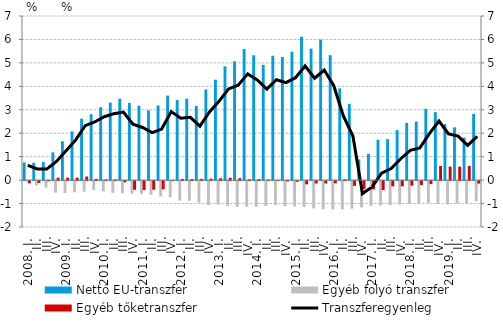
| Category | Nettó EU-transzfer | Egyéb folyó transzfer | Egyéb tőketranszfer |
|---|---|---|---|
| 2008. I. | 0.75 | -0.024 | -0.097 |
|          II. | 0.743 | -0.185 | -0.082 |
|          III. | 0.767 | -0.28 | -0.013 |
|          IV. | 1.184 | -0.492 | 0.103 |
| 2009. I. | 1.658 | -0.508 | 0.104 |
|          II. | 2.079 | -0.479 | 0.104 |
|          III. | 2.622 | -0.454 | 0.154 |
|          IV. | 2.81 | -0.383 | 0.054 |
| 2010. I. | 3.112 | -0.434 | 0.026 |
|          II. | 3.308 | -0.5 | 0.028 |
|          III. | 3.471 | -0.519 | -0.052 |
|          IV. | 3.293 | -0.534 | -0.37 |
| 2011. I. | 3.175 | -0.547 | -0.382 |
|          II. | 2.976 | -0.586 | -0.367 |
|          III. | 3.184 | -0.66 | -0.348 |
|          IV. | 3.605 | -0.69 | 0.007 |
| 2012. I. | 3.416 | -0.83 | 0.051 |
|          II. | 3.472 | -0.839 | 0.045 |
|          III. | 3.164 | -0.916 | 0.053 |
|          IV. | 3.867 | -1.021 | 0.064 |
| 2013. I. | 4.283 | -0.996 | 0.079 |
| II. | 4.854 | -1.062 | 0.099 |
|          III. | 5.067 | -1.099 | 0.082 |
| IV. | 5.594 | -1.097 | 0.034 |
| 2014. I. | 5.324 | -1.099 | 0.044 |
| II. | 4.914 | -1.057 | 0.021 |
|          III. | 5.306 | -1.024 | 0 |
| IV. | 5.253 | -1.075 | -0.019 |
| 2015. I. | 5.479 | -1.081 | -0.03 |
| II. | 6.114 | -1.111 | -0.136 |
|          III. | 5.608 | -1.163 | -0.1 |
| IV. | 5.991 | -1.196 | -0.099 |
| 2016. I. | 5.33 | -1.213 | -0.092 |
| II. | 3.912 | -1.207 | 0.037 |
|          III. | 3.254 | -1.171 | -0.203 |
| IV. | 0.879 | -1.12 | -0.333 |
| 2017. I. | 1.119 | -1.057 | -0.353 |
| II. | 1.723 | -1.045 | -0.384 |
|          III. | 1.746 | -1.03 | -0.226 |
| IV. | 2.133 | -0.999 | -0.221 |
| 2018. I. | 2.442 | -0.974 | -0.195 |
| II. | 2.495 | -0.952 | -0.167 |
|          III. | 3.041 | -0.929 | -0.125 |
| IV. | 2.899 | -0.983 | 0.604 |
| 2019. I. | 2.385 | -0.994 | 0.578 |
| II. | 2.251 | -0.95 | 0.573 |
|          III. | 1.813 | -0.939 | 0.609 |
| IV. | 2.828 | -0.859 | -0.107 |